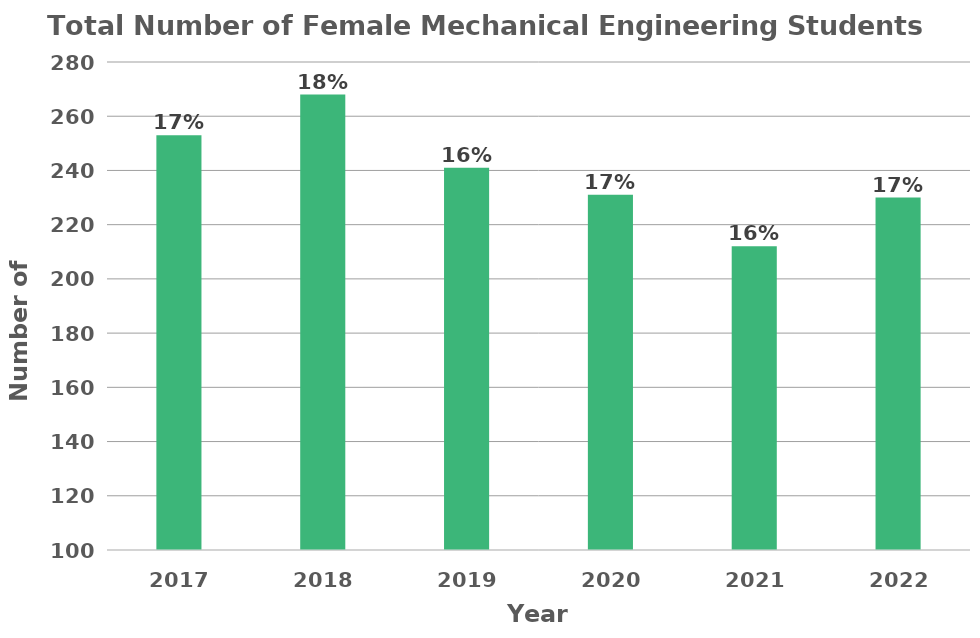
| Category | Total Number of Female Mechanical Engineering Students |
|---|---|
| 2017.0 | 253 |
| 2018.0 | 268 |
| 2019.0 | 241 |
| 2020.0 | 231 |
| 2021.0 | 212 |
| 2022.0 | 230 |